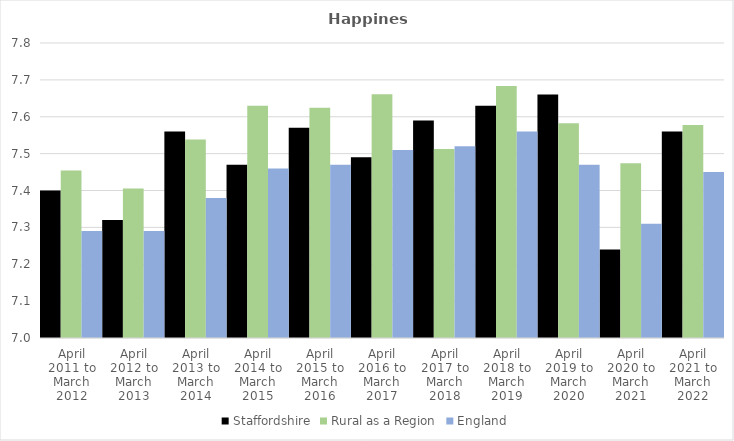
| Category | Staffordshire | Rural as a Region | England |
|---|---|---|---|
| April 2011 to March 2012 | 7.4 | 7.454 | 7.29 |
| April 2012 to March 2013 | 7.32 | 7.406 | 7.29 |
| April 2013 to March 2014 | 7.56 | 7.539 | 7.38 |
| April 2014 to March 2015 | 7.47 | 7.63 | 7.46 |
| April 2015 to March 2016 | 7.57 | 7.625 | 7.47 |
| April 2016 to March 2017 | 7.49 | 7.661 | 7.51 |
| April 2017 to March 2018 | 7.59 | 7.513 | 7.52 |
| April 2018 to March 2019 | 7.63 | 7.684 | 7.56 |
| April 2019 to March 2020 | 7.66 | 7.582 | 7.47 |
| April 2020 to March 2021 | 7.24 | 7.474 | 7.31 |
| April 2021 to March 2022 | 7.56 | 7.577 | 7.45 |